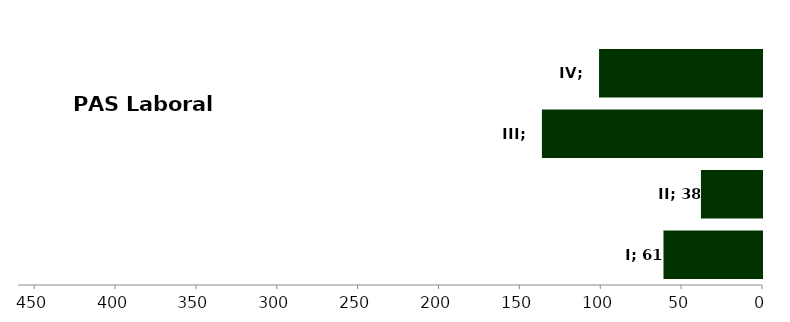
| Category | Series 3 |
|---|---|
| I | 60.917 |
| II | 37.75 |
| III | 136.083 |
| IV | 100.75 |